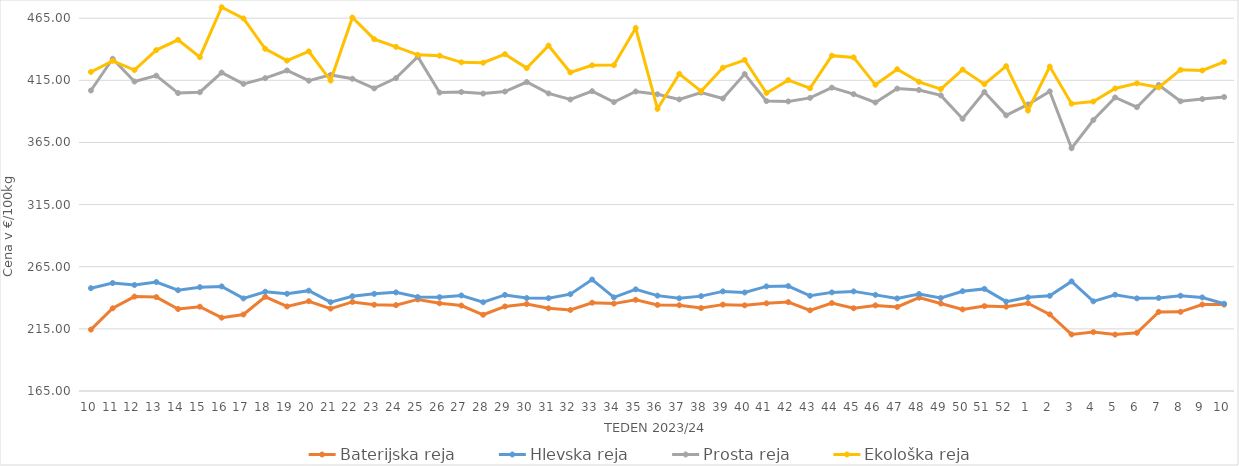
| Category | Baterijska reja | Hlevska reja | Prosta reja | Ekološka reja |
|---|---|---|---|---|
| 10.0 | 214.42 | 247.73 | 406.8 | 421.72 |
| 11.0 | 231.56 | 251.88 | 432.34 | 430.69 |
| 12.0 | 240.97 | 250.3 | 414 | 423.28 |
| 13.0 | 240.55 | 252.7 | 418.74 | 439.31 |
| 14.0 | 230.99 | 246.12 | 404.72 | 447.59 |
| 15.0 | 232.82 | 248.56 | 405.42 | 433.62 |
| 16.0 | 224 | 249.17 | 421.22 | 473.79 |
| 17.0 | 226.57 | 239.5 | 412.13 | 464.83 |
| 18.0 | 240.83 | 244.89 | 416.74 | 440.35 |
| 19.0 | 233.05 | 243.26 | 422.93 | 430.86 |
| 20.0 | 237.25 | 245.73 | 414.68 | 438.28 |
| 21.0 | 231.3 | 236.5 | 419.36 | 414.83 |
| 22.0 | 236.67 | 241.27 | 416.27 | 465.52 |
| 23.0 | 234.39 | 243.16 | 408.53 | 448.1 |
| 24.0 | 234.08 | 244.37 | 416.78 | 441.9 |
| 25.0 | 238.69 | 240.6 | 434.05 | 435.52 |
| 26.0 | 235.57 | 240.51 | 405.15 | 434.83 |
| 27.0 | 233.75 | 241.89 | 405.58 | 429.48 |
| 28.0 | 226.35 | 236.46 | 404.32 | 429.14 |
| 29.0 | 233.03 | 242.31 | 405.96 | 436.04 |
| 30.0 | 235 | 239.8 | 413.63 | 424.83 |
| 31.0 | 231.55 | 239.67 | 404.46 | 442.93 |
| 32.0 | 230.2 | 242.89 | 399.57 | 421.38 |
| 33.0 | 236.04 | 254.68 | 406.23 | 427.07 |
| 34.0 | 235.32 | 240.35 | 397.45 | 427.24 |
| 35.0 | 238.39 | 246.82 | 406 | 457.07 |
| 36.0 | 234.27 | 241.75 | 403.79 | 392.07 |
| 37.0 | 234 | 239.58 | 399.61 | 420.17 |
| 38.0 | 231.74 | 241.34 | 405.14 | 406.21 |
| 39.0 | 234.5 | 245.15 | 400.39 | 425.17 |
| 40.0 | 233.92 | 244.29 | 420.04 | 431.38 |
| 41.0 | 235.54 | 249.18 | 398.28 | 404.83 |
| 42.0 | 236.54 | 249.42 | 398.03 | 415.17 |
| 43.0 | 229.92 | 241.62 | 400.86 | 408.62 |
| 44.0 | 235.77 | 244.36 | 409.1 | 434.83 |
| 45.0 | 231.6 | 245.16 | 403.86 | 433.45 |
| 46.0 | 233.89 | 242.36 | 397.17 | 411.38 |
| 47.0 | 232.62 | 239.48 | 408.34 | 423.97 |
| 48.0 | 240.11 | 243.04 | 407.25 | 413.79 |
| 49.0 | 235.41 | 239.81 | 402.87 | 407.93 |
| 50.0 | 230.65 | 245.3 | 384.02 | 423.62 |
| 51.0 | 233.3 | 247.16 | 405.6 | 411.9 |
| 52.0 | 232.85 | 236.91 | 386.82 | 426.38 |
| 1.0 | 235.66 | 240.38 | 395.59 | 390.69 |
| 2.0 | 226.65 | 241.59 | 406.11 | 426.03 |
| 3.0 | 210.5 | 253.21 | 360.35 | 396.21 |
| 4.0 | 212.37 | 237.14 | 383.09 | 397.93 |
| 5.0 | 210.38 | 242.47 | 401.23 | 408.45 |
| 6.0 | 211.82 | 239.54 | 393.39 | 412.59 |
| 7.0 | 228.66 | 239.86 | 411.29 | 409.31 |
| 8.0 | 228.73 | 241.68 | 398.12 | 423.45 |
| 9.0 | 234.57 | 240.29 | 399.93 | 422.93 |
| 10.0 | 234.52 | 235.22 | 401.58 | 429.83 |